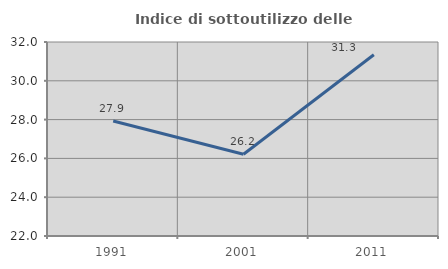
| Category | Indice di sottoutilizzo delle abitazioni  |
|---|---|
| 1991.0 | 27.928 |
| 2001.0 | 26.217 |
| 2011.0 | 31.343 |